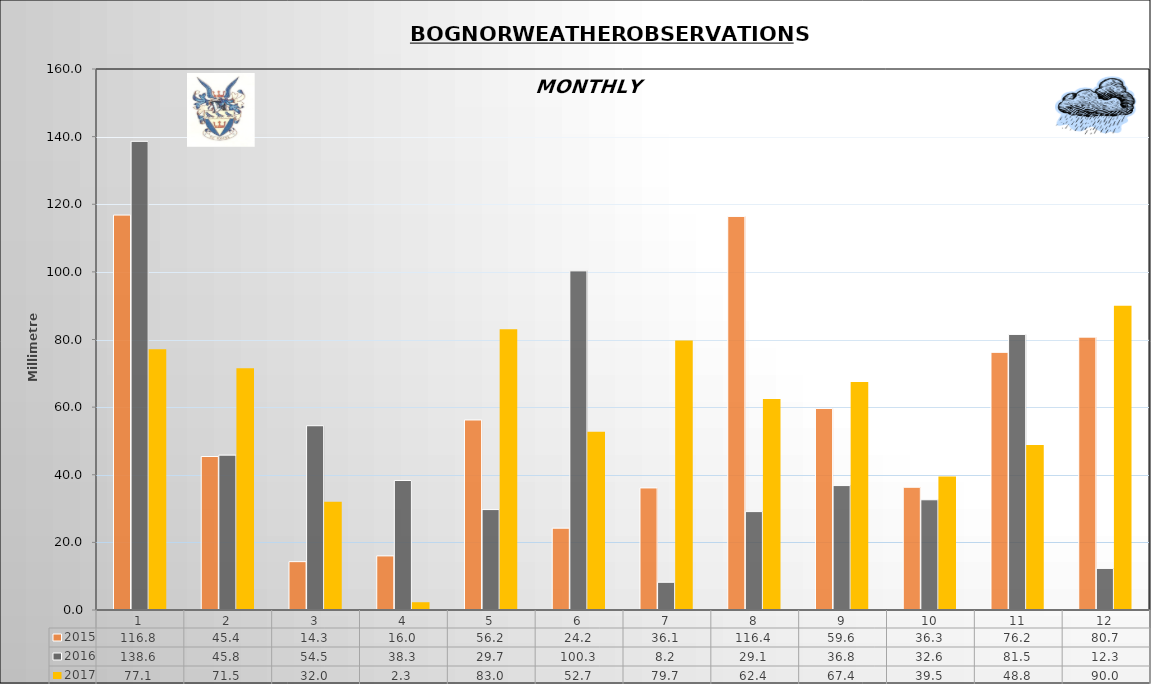
| Category | 2015 | 2016 | 2017 |
|---|---|---|---|
| 0 | 116.8 | 138.6 | 77.1 |
| 1 | 45.4 | 45.8 | 71.5 |
| 2 | 14.3 | 54.5 | 32 |
| 3 | 16 | 38.3 | 2.3 |
| 4 | 56.2 | 29.7 | 83 |
| 5 | 24.2 | 100.3 | 52.7 |
| 6 | 36.1 | 8.2 | 79.7 |
| 7 | 116.4 | 29.1 | 62.4 |
| 8 | 59.6 | 36.8 | 67.4 |
| 9 | 36.3 | 32.6 | 39.5 |
| 10 | 76.2 | 81.5 | 48.8 |
| 11 | 80.7 | 12.3 | 90 |